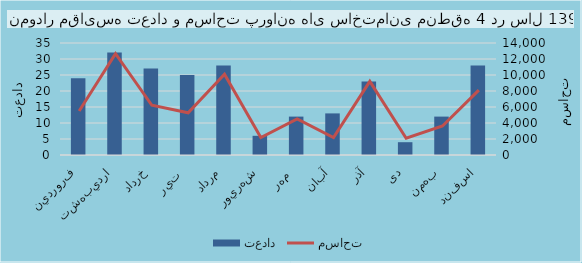
| Category | تعداد |
|---|---|
| فروردين | 24 |
| ارديبهشت | 32 |
| خرداد | 27 |
| تير  | 25 |
| مرداد | 28 |
| شهريور | 6 |
| مهر  | 12 |
| آبان | 13 |
| آذر | 23 |
| دی | 4 |
| بهمن | 12 |
| اسفند | 28 |